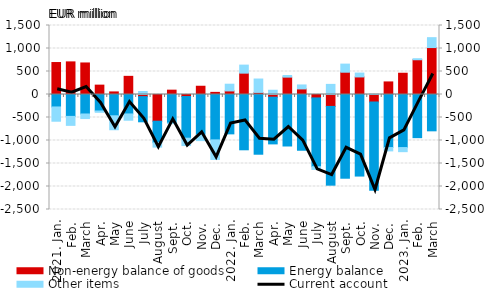
| Category | Non-energy balance of goods | Energy balance | Other items |
|---|---|---|---|
| 2021. Jan. | 695.038 | -270.909 | -310.128 |
| Feb. | 709.099 | -475.704 | -195.183 |
| March | 685.674 | -423.565 | -99.249 |
| Apr. | 203.564 | -358.231 | -28.668 |
| May | 56.081 | -462.948 | -303.172 |
| June | 394.68 | -422.909 | -136.479 |
| July | -46.84 | -546.536 | 65.791 |
| August | -580.85 | -466.959 | -95.859 |
| Sept. | 94.203 | -622.36 | -11.273 |
| Oct. | -44.297 | -905.592 | -160.008 |
| Nov. | 179.293 | -875.351 | -127.088 |
| Dec. | 46.143 | -986.524 | -425.078 |
| 2022. Jan. | 77.509 | -855.658 | 146.284 |
| Feb. | 464.094 | -1202.104 | 174.741 |
| March | 45.422 | -1298.214 | 291.034 |
| Apr. | -58.268 | -1015.443 | 92.537 |
| May | 377.575 | -1119.512 | 34.903 |
| June | 121.504 | -1211.956 | 86.206 |
| July | -74.332 | -1495.218 | -58.729 |
| August | -259.127 | -1711.952 | 219.996 |
| Sept. | 484.443 | -1820.019 | 176.144 |
| Oct. | 381.809 | -1773.099 | 84.228 |
| Nov. | -164.869 | -1918.58 | 6.96 |
| Dec. | 273.392 | -1153.364 | -72.646 |
| 2023. Jan. | 462.144 | -1153.535 | -89.317 |
| Feb. | 755.214 | -938.153 | 22.597 |
| March | 1020.458 | -789.739 | 215.228 |